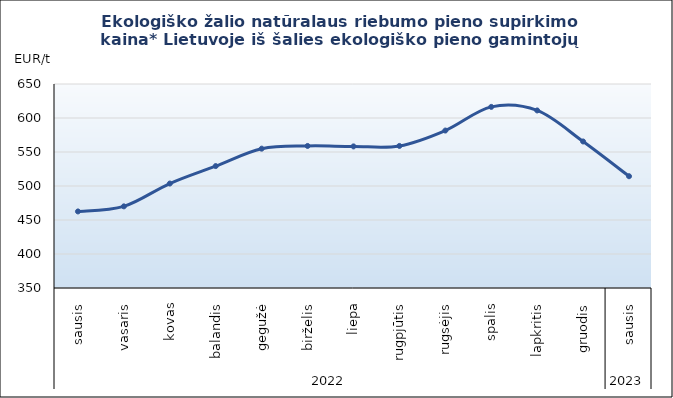
| Category | Ekologiško žalio natūralaus riebumo pieno supirkimo kaina* Lietuvoje iš šalies ekologiško pieno gamintojų |
|---|---|
| 0 | 462.59 |
| 1 | 470.07 |
| 2 | 503.61 |
| 3 | 529.3 |
| 4 | 554.9 |
| 5 | 558.89 |
| 6 | 558.23 |
| 7 | 558.92 |
| 8 | 581.56 |
| 9 | 616.34 |
| 10 | 611.11 |
| 11 | 565.47 |
| 12 | 514.35 |